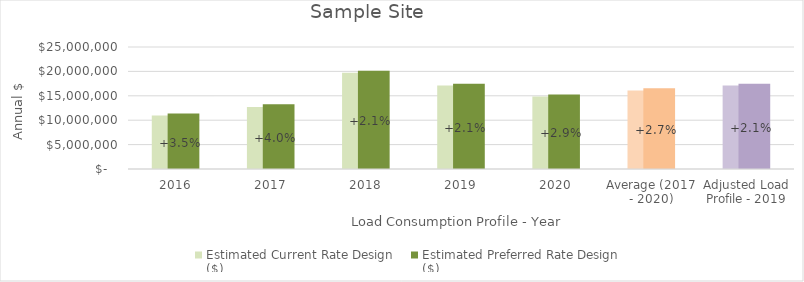
| Category | Estimated Current Rate Design
($) | Estimated Preferred Rate Design
($) |
|---|---|---|
| 2016 | 10977762.221 | 11358160.149 |
| 2017 | 12727994.395 | 13243146.395 |
| 2018 | 19718430.503 | 20128684.278 |
| 2019 | 17110779.723 | 17469985.951 |
| 2020 | 14844783.183 | 15276069.753 |
| Average (2017 - 2020) | 16100496.951 | 16529471.594 |
| Adjusted Load Profile - 2019 | 17110779.723 | 17469985.887 |